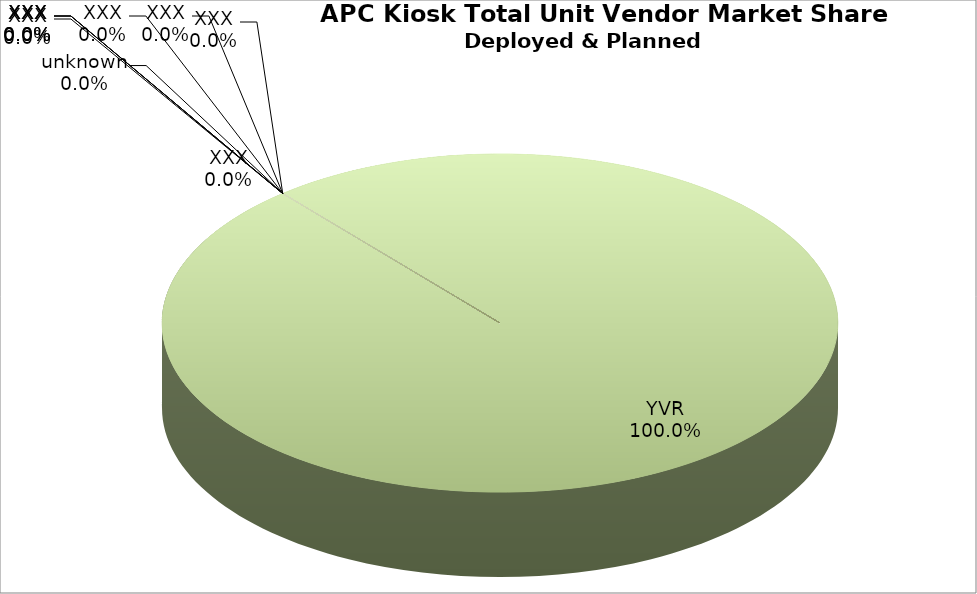
| Category | Airport Installations |
|---|---|
| YVR | 1 |
| XXX | 0 |
| XXX | 0 |
| XXX | 0 |
| XXX | 0 |
| XXX | 0 |
| XXX | 0 |
| XXX | 0 |
| XXX | 0 |
| unknown | 0 |